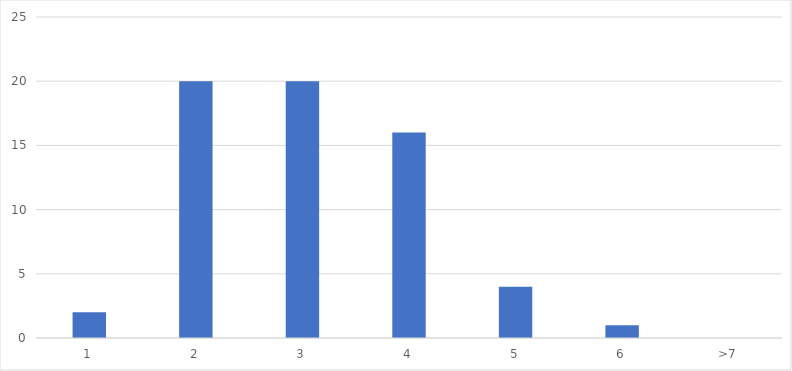
| Category | Number of Responses |
|---|---|
| 1 | 2 |
| 2 | 20 |
| 3 | 20 |
| 4 | 16 |
| 5 | 4 |
| 6 | 1 |
| >7 | 0 |